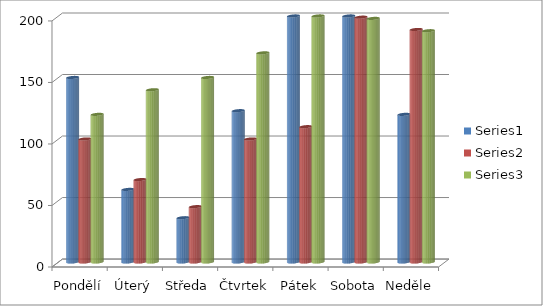
| Category | Series 0 | Series 1 | Series 2 |
|---|---|---|---|
| Pondělí | 150 | 100 | 120 |
| Úterý | 59 | 67 | 140 |
| Středa | 36 | 45 | 150 |
| Čtvrtek | 123 | 100 | 170 |
| Pátek | 200 | 110 | 200 |
| Sobota | 200 | 199 | 198 |
| Neděle | 120 | 189 | 188 |